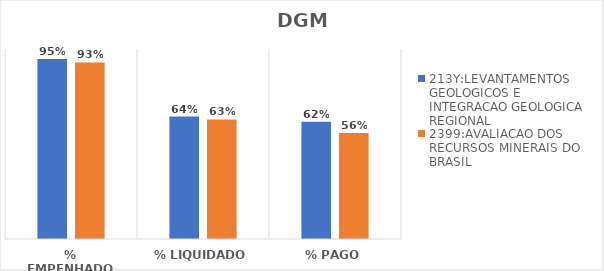
| Category | 213Y:LEVANTAMENTOS GEOLOGICOS E INTEGRACAO GEOLOGICA REGIONAL | 2399:AVALIACAO DOS RECURSOS MINERAIS DO BRASIL |
|---|---|---|
| % EMPENHADO | 0.947 | 0.929 |
| % LIQUIDADO | 0.644 | 0.629 |
| % PAGO | 0.617 | 0.558 |